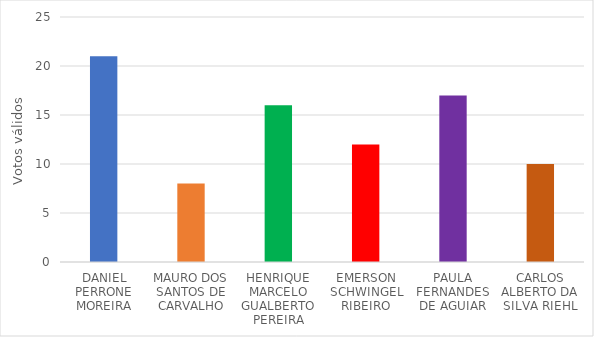
| Category | Series 0 |
|---|---|
| DANIEL PERRONE MOREIRA | 21 |
| MAURO DOS SANTOS DE CARVALHO | 8 |
| HENRIQUE MARCELO GUALBERTO PEREIRA | 16 |
| EMERSON SCHWINGEL RIBEIRO | 12 |
| PAULA FERNANDES DE AGUIAR | 17 |
| CARLOS ALBERTO DA SILVA RIEHL | 10 |